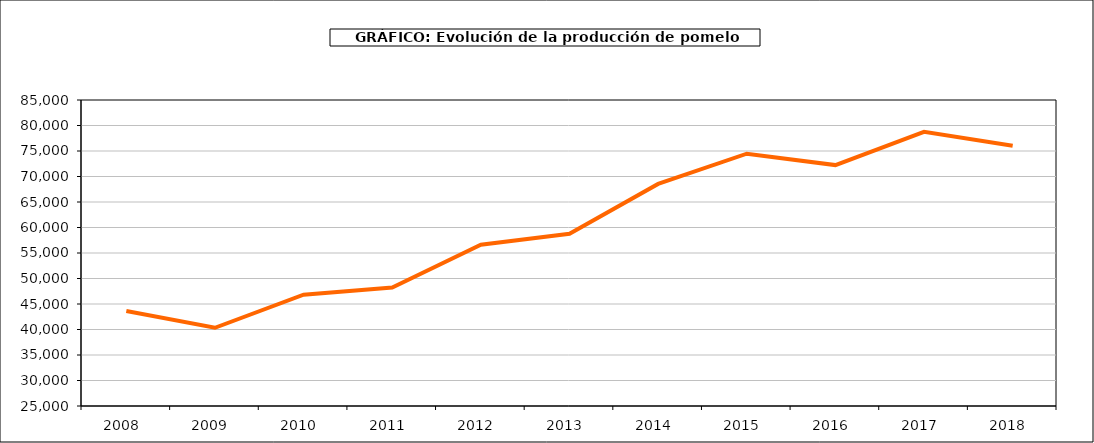
| Category | producción |
|---|---|
| 2008.0 | 43639 |
| 2009.0 | 40339 |
| 2010.0 | 46824 |
| 2011.0 | 48231 |
| 2012.0 | 56634 |
| 2013.0 | 58770 |
| 2014.0 | 68545 |
| 2015.0 | 74470 |
| 2016.0 | 72236 |
| 2017.0 | 78752 |
| 2018.0 | 76044 |